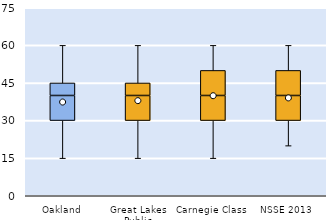
| Category | 25th | 50th | 75th |
|---|---|---|---|
| Oakland | 30 | 10 | 5 |
| Great Lakes Public | 30 | 10 | 5 |
| Carnegie Class | 30 | 10 | 10 |
| NSSE 2013 | 30 | 10 | 10 |